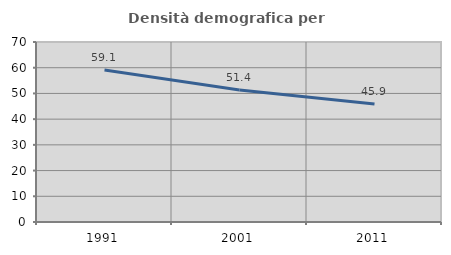
| Category | Densità demografica |
|---|---|
| 1991.0 | 59.082 |
| 2001.0 | 51.364 |
| 2011.0 | 45.908 |